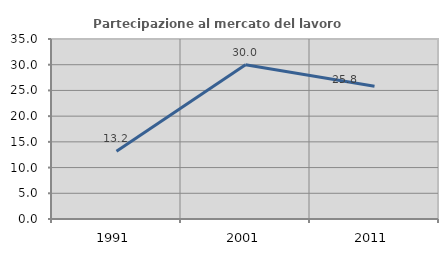
| Category | Partecipazione al mercato del lavoro  femminile |
|---|---|
| 1991.0 | 13.158 |
| 2001.0 | 30 |
| 2011.0 | 25.806 |